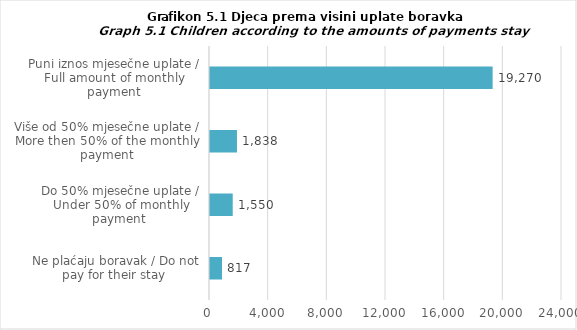
| Category | Series 4 |
|---|---|
| Ne plaćaju boravak / Do not pay for their stay  | 817 |
| Do 50% mjesečne uplate / Under 50% of monthly payment  | 1550 |
| Više od 50% mjesečne uplate / More then 50% of the monthly payment | 1838 |
| Puni iznos mjesečne uplate / Full amount of monthly payment | 19270 |